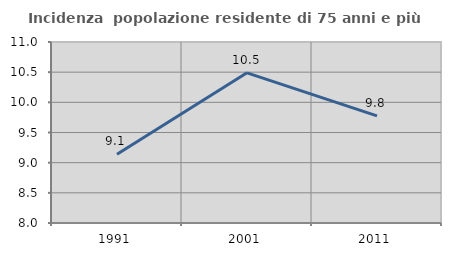
| Category | Incidenza  popolazione residente di 75 anni e più |
|---|---|
| 1991.0 | 9.141 |
| 2001.0 | 10.489 |
| 2011.0 | 9.775 |